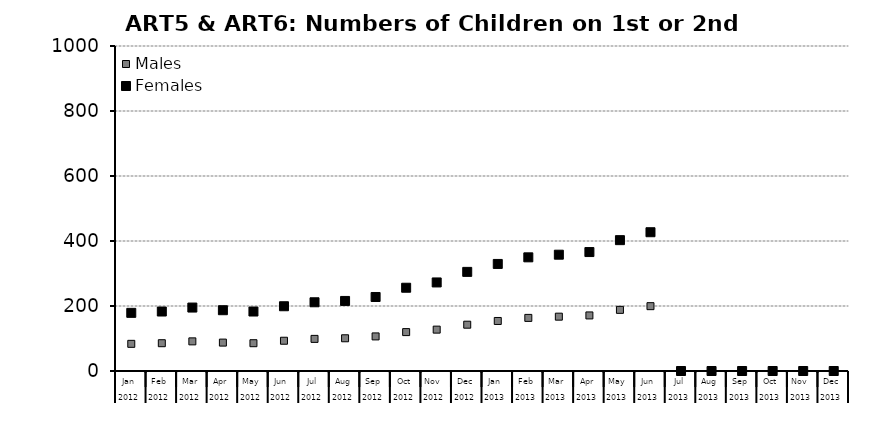
| Category | Males | Females |
|---|---|---|
| 0 | 83.6 | 178.933 |
| 1 | 85.5 | 183 |
| 2 | 91.2 | 195.2 |
| 3 | 87.4 | 187.067 |
| 4 | 85.5 | 183 |
| 5 | 93.1 | 199.267 |
| 6 | 98.8 | 211.467 |
| 7 | 100.7 | 215.533 |
| 8 | 106.4 | 227.733 |
| 9 | 119.7 | 256.2 |
| 10 | 127.3 | 272.467 |
| 11 | 142.5 | 305 |
| 12 | 153.9 | 329.4 |
| 13 | 163.4 | 349.733 |
| 14 | 167.2 | 357.867 |
| 15 | 171 | 366 |
| 16 | 188.1 | 402.6 |
| 17 | 199.5 | 427 |
| 18 | 0 | 0 |
| 19 | 0 | 0 |
| 20 | 0 | 0 |
| 21 | 0 | 0 |
| 22 | 0 | 0 |
| 23 | 0 | 0 |